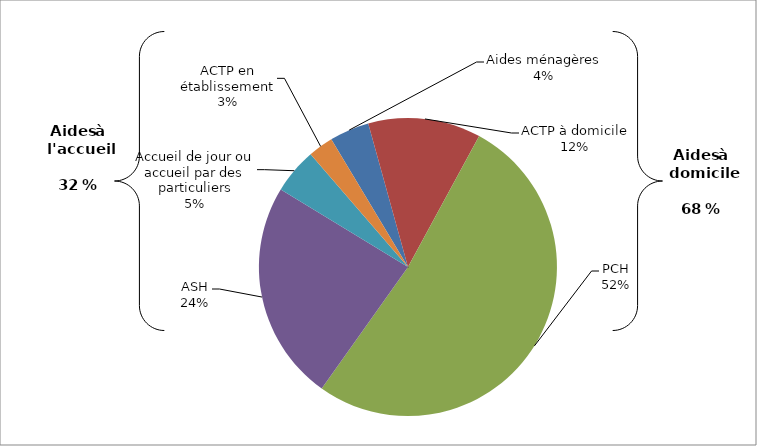
| Category | Series 0 | Series 1 |
|---|---|---|
| Aides ménagères | 20687 | 0.043 |
| ACTP à domicile | 58654 | 0.122 |
| PCH | 249010 | 0.519 |
| ASH | 114533 | 0.239 |
| Accueil de jour ou accueil par des particuliers | 23761 | 0.05 |
| ACTP en établissement | 13104 | 0.027 |